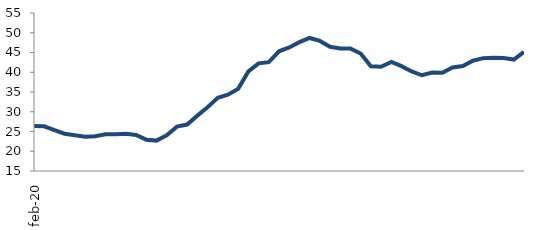
| Category | Series 0 |
|---|---|
| 2020-02-01 | 26.375 |
| 2020-03-01 | 26.322 |
| 2020-04-01 | 25.369 |
| 2020-05-01 | 24.446 |
| 2020-06-01 | 24.028 |
| 2020-07-01 | 23.685 |
| 2020-08-01 | 23.782 |
| 2020-09-01 | 24.28 |
| 2020-10-01 | 24.323 |
| 2020-11-01 | 24.433 |
| 2020-12-01 | 24.131 |
| 2021-01-01 | 22.928 |
| 2021-02-01 | 22.701 |
| 2021-03-01 | 24.039 |
| 2021-04-01 | 26.229 |
| 2021-05-01 | 26.758 |
| 2021-06-01 | 29.013 |
| 2021-07-01 | 31.153 |
| 2021-08-01 | 33.54 |
| 2021-09-01 | 34.33 |
| 2021-10-01 | 35.804 |
| 2021-11-01 | 40.209 |
| 2021-12-01 | 42.248 |
| 2022-01-01 | 42.562 |
| 2022-02-01 | 45.314 |
| 2022-03-01 | 46.285 |
| 2022-04-01 | 47.614 |
| 2022-05-01 | 48.674 |
| 2022-06-01 | 47.931 |
| 2022-07-01 | 46.442 |
| 2022-08-01 | 46 |
| 2022-09-01 | 45.983 |
| 2022-10-01 | 44.739 |
| 2022-11-01 | 41.492 |
| 2022-12-01 | 41.391 |
| 2023-01-01 | 42.634 |
| 2023-02-01 | 41.54 |
| 2023-03-01 | 40.198 |
| 2023-04-01 | 39.238 |
| 2023-05-01 | 39.944 |
| 2023-06-01 | 39.891 |
| 2023-07-01 | 41.221 |
| 2023-08-01 | 41.581 |
| 2023-09-01 | 42.921 |
| 2023-10-01 | 43.562 |
| 2023-11-01 | 43.666 |
| 2023-12-01 | 43.623 |
| 2024-01-01 | 43.217 |
| 2024-02-01 | 45.144 |